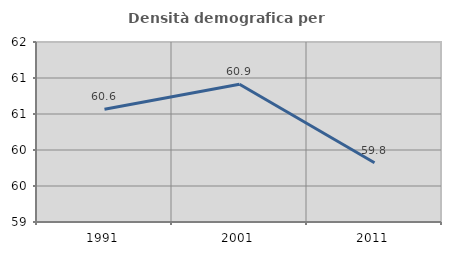
| Category | Densità demografica |
|---|---|
| 1991.0 | 60.567 |
| 2001.0 | 60.912 |
| 2011.0 | 59.822 |